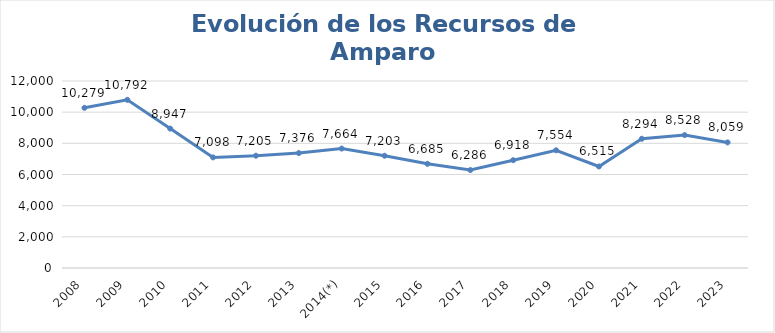
| Category | Series 0 |
|---|---|
| 2008 | 10279 |
| 2009 | 10792 |
| 2010 | 8947 |
| 2011 | 7098 |
| 2012 | 7205 |
| 2013 | 7376 |
| 2014(*) | 7664 |
| 2015 | 7203 |
| 2016 | 6685 |
| 2017 | 6286 |
| 2018 | 6918 |
| 2019 | 7554 |
| 2020 | 6515 |
| 2021 | 8294 |
| 2022 | 8528 |
| 2023 | 8059 |